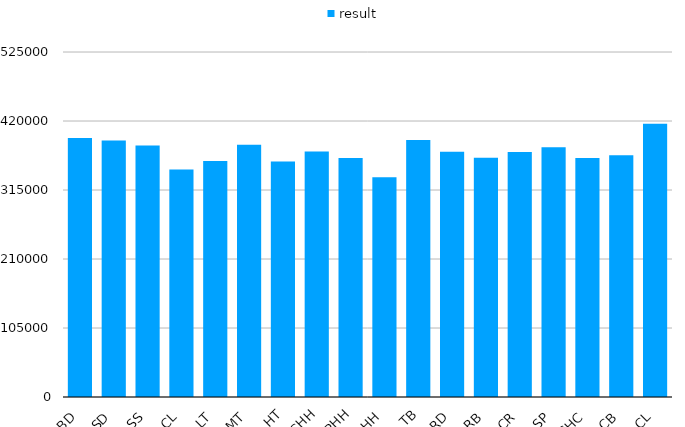
| Category | result |
|---|---|
| BD | 394222 |
| SD | 390514 |
| SS | 382558 |
| CL | 346285 |
| LT | 359292 |
| MT | 383705 |
| HT | 358437 |
| CHH | 373739 |
| PHH | 363533 |
| OHH | 334519 |
| TB | 390913 |
| RD | 373253 |
| RB | 363905 |
| CR | 372949 |
| SP | 380179 |
| CHC | 363619 |
| CB | 368032 |
| CL | 415816 |